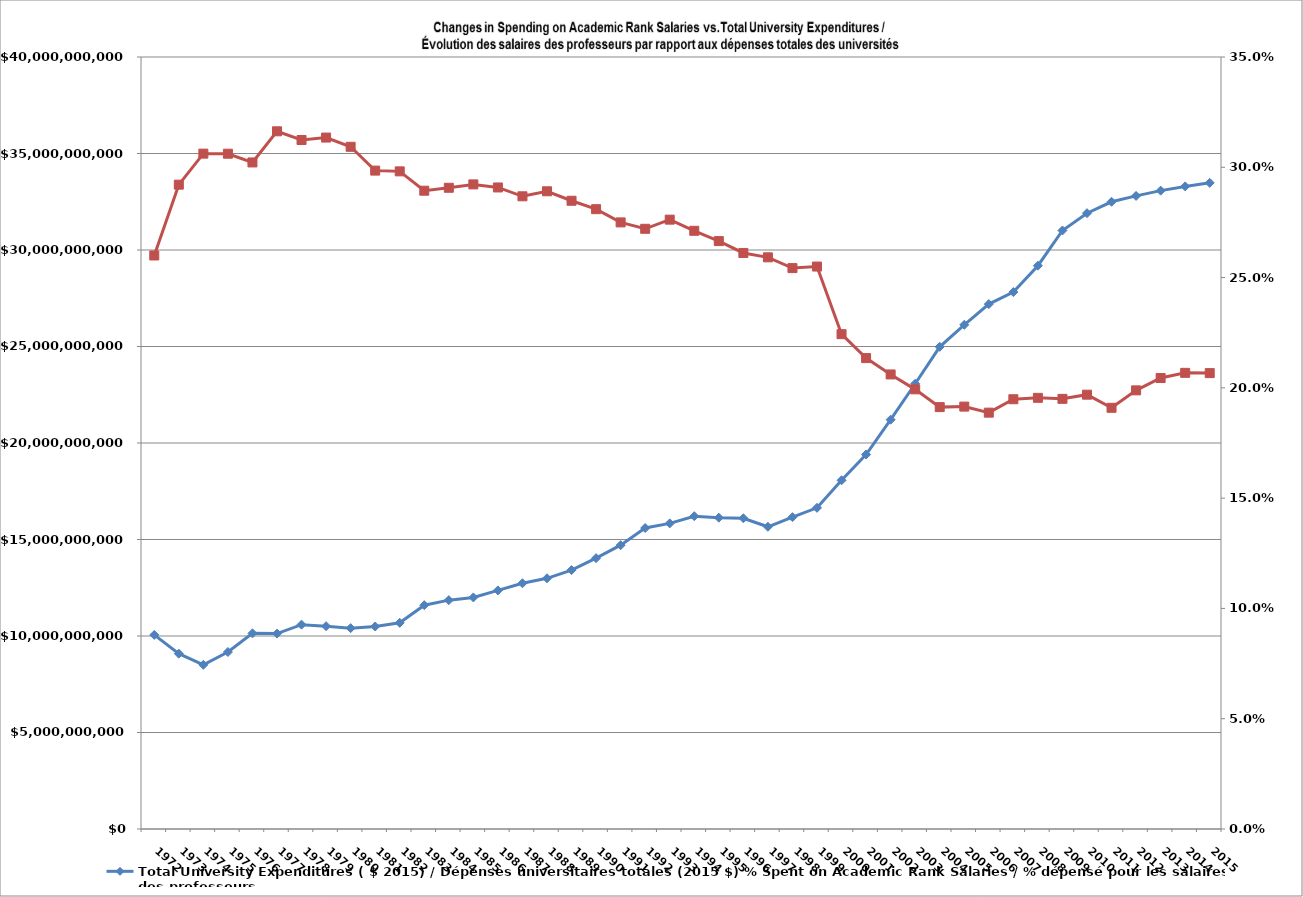
| Category | Total University Expenditures ( $ 2015) / Dépenses universitaires totales (2015 $) % Spent on Academic Rank Salaries / % dépensé pour les salaires des professeurs |
|---|---|
| 1972.0 | 10056028767.123 |
| 1973.0 | 9084730169.492 |
| 1974.0 | 8506756534.351 |
| 1975.0 | 9170388868.966 |
| 1976.0 | 10138714186.495 |
| 1977.0 | 10124217071.429 |
| 1978.0 | 10587813967.213 |
| 1979.0 | 10509151455 |
| 1980.0 | 10406563159.091 |
| 1981.0 | 10492229478.788 |
| 1982.0 | 10682893103.825 |
| 1983.0 | 11596202643.718 |
| 1984.0 | 11858108079.208 |
| 1985.0 | 12000028171.429 |
| 1986.0 | 12362785271.341 |
| 1987.0 | 12732999223.358 |
| 1988.0 | 12989616969.101 |
| 1989.0 | 13414916815.508 |
| 1990.0 | 14033561556.122 |
| 1991.0 | 14704596115.942 |
| 1992.0 | 15593908278.571 |
| 1993.0 | 15835482953.271 |
| 1994.0 | 16207516655.776 |
| 1995.0 | 16130510657.534 |
| 1996.0 | 16100731667.042 |
| 1997.0 | 15658782882.743 |
| 1998.0 | 16157494863.089 |
| 1999.0 | 16642061954.79 |
| 2000.0 | 18067768100.629 |
| 2001.0 | 19402995607.362 |
| 2002.0 | 21207820578 |
| 2003.0 | 23070763809.339 |
| 2004.0 | 24984473724.928 |
| 2005.0 | 26125340461.682 |
| 2006.0 | 27196745785.518 |
| 2007.0 | 27821261747.085 |
| 2008.0 | 29185952355.828 |
| 2009.0 | 31011470103.147 |
| 2010.0 | 31907026254.077 |
| 2011.0 | 32497877894.912 |
| 2012.0 | 32802748654.067 |
| 2013.0 | 33076327353.42 |
| 2014.0 | 33294355020.767 |
| 2015.0 | 33479290000 |